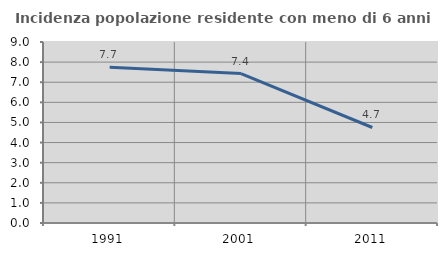
| Category | Incidenza popolazione residente con meno di 6 anni |
|---|---|
| 1991.0 | 7.741 |
| 2001.0 | 7.432 |
| 2011.0 | 4.749 |